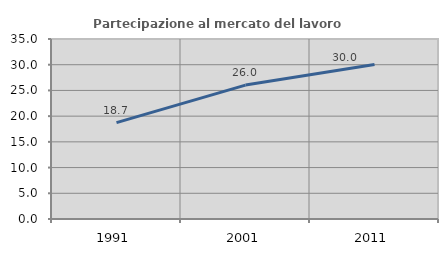
| Category | Partecipazione al mercato del lavoro  femminile |
|---|---|
| 1991.0 | 18.729 |
| 2001.0 | 26.038 |
| 2011.0 | 30.041 |